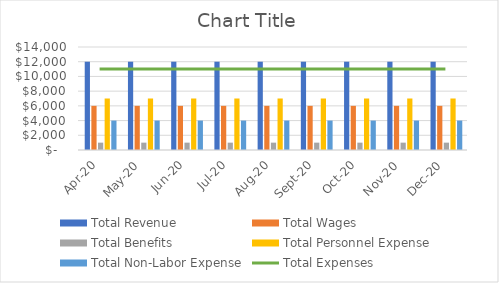
| Category | Total Revenue | Total Wages | Total Benefits | Total Personnel Expense | Total Non-Labor Expense |
|---|---|---|---|---|---|
| 2020-04-01 | 12000 | 6000 | 1000 | 7000 | 4000 |
| 2020-05-01 | 12000 | 6000 | 1000 | 7000 | 4000 |
| 2020-06-01 | 12000 | 6000 | 1000 | 7000 | 4000 |
| 2020-07-01 | 12000 | 6000 | 1000 | 7000 | 4000 |
| 2020-08-01 | 12000 | 6000 | 1000 | 7000 | 4000 |
| 2020-09-01 | 12000 | 6000 | 1000 | 7000 | 4000 |
| 2020-10-01 | 12000 | 6000 | 1000 | 7000 | 4000 |
| 2020-11-01 | 12000 | 6000 | 1000 | 7000 | 4000 |
| 2020-12-01 | 12000 | 6000 | 1000 | 7000 | 4000 |